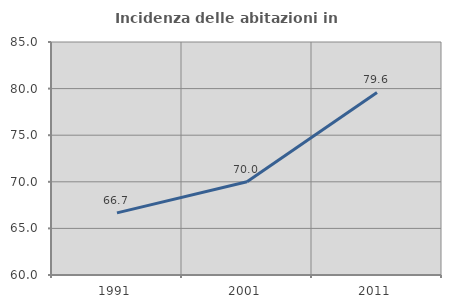
| Category | Incidenza delle abitazioni in proprietà  |
|---|---|
| 1991.0 | 66.667 |
| 2001.0 | 70 |
| 2011.0 | 79.592 |